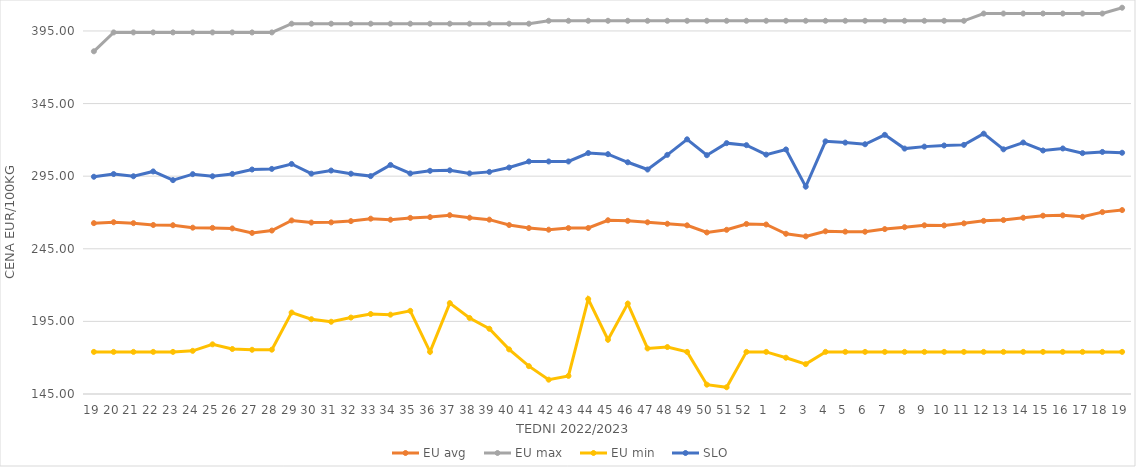
| Category | EU avg | EU max | EU min | SLO |
|---|---|---|---|---|
| 19.0 | 262.669 | 381 | 174 | 294.6 |
| 20.0 | 263.291 | 394 | 174 | 296.48 |
| 21.0 | 262.64 | 394 | 174 | 294.94 |
| 22.0 | 261.388 | 394 | 174 | 298.26 |
| 23.0 | 261.228 | 394 | 174 | 292.27 |
| 24.0 | 259.544 | 394 | 174.72 | 296.39 |
| 25.0 | 259.395 | 394 | 179.2 | 294.93 |
| 26.0 | 259.018 | 394 | 176 | 296.56 |
| 27.0 | 255.922 | 394 | 175.451 | 299.59 |
| 28.0 | 257.564 | 394 | 175.52 | 300.01 |
| 29.0 | 264.52 | 400 | 201.097 | 303.41 |
| 30.0 | 263.067 | 400 | 196.496 | 296.73 |
| 31.0 | 263.196 | 400 | 194.756 | 298.88 |
| 32.0 | 264.059 | 400 | 197.634 | 296.7 |
| 33.0 | 265.729 | 400 | 200.07 | 295.05 |
| 34.0 | 265.016 | 400 | 199.637 | 302.73 |
| 35.0 | 266.273 | 400 | 202.277 | 296.86 |
| 36.0 | 266.807 | 400 | 174 | 298.7 |
| 37.0 | 268.136 | 400 | 207.594 | 299.02 |
| 38.0 | 266.39 | 400 | 197.352 | 296.91 |
| 39.0 | 265.059 | 400 | 189.926 | 297.96 |
| 40.0 | 261.35 | 400 | 175.723 | 300.95 |
| 41.0 | 259.271 | 400 | 164.165 | 305.13 |
| 42.0 | 258.146 | 402 | 154.869 | 305.13 |
| 43.0 | 259.256 | 402 | 157.459 | 305.13 |
| 44.0 | 259.32 | 402 | 210.415 | 310.93 |
| 45.0 | 264.649 | 402 | 182.35 | 310.16 |
| 46.0 | 264.228 | 402 | 207.247 | 304.58 |
| 47.0 | 263.24 | 402 | 176.378 | 299.59 |
| 48.0 | 262.225 | 402 | 177.332 | 309.69 |
| 49.0 | 261.152 | 402 | 174 | 320.38 |
| 50.0 | 256.24 | 402 | 151.434 | 309.44 |
| 51.0 | 258.071 | 402 | 149.638 | 317.74 |
| 52.0 | 262.088 | 402 | 174 | 316.36 |
| 1.0 | 261.716 | 402 | 174 | 309.84 |
| 2.0 | 255.331 | 402 | 169.983 | 313.4 |
| 3.0 | 253.546 | 402 | 165.574 | 287.81 |
| 4.0 | 257.051 | 402 | 174 | 318.98 |
| 5.0 | 256.808 | 402 | 174 | 318.13 |
| 6.0 | 256.75 | 402 | 174 | 316.99 |
| 7.0 | 258.565 | 402 | 174 | 323.47 |
| 8.0 | 259.872 | 402 | 174 | 314 |
| 9.0 | 261.164 | 402 | 174 | 315.35 |
| 10.0 | 261.06 | 402 | 174 | 316.13 |
| 11.0 | 262.513 | 402 | 174 | 316.55 |
| 12.0 | 264.228 | 407 | 174 | 324.27 |
| 13.0 | 264.768 | 407 | 174 | 313.49 |
| 14.0 | 266.385 | 407 | 174 | 318.17 |
| 15.0 | 267.797 | 407 | 174 | 312.7 |
| 16.0 | 268.021 | 407 | 174 | 314.07 |
| 17.0 | 267.039 | 407 | 174 | 310.87 |
| 18.0 | 270.254 | 407 | 174 | 311.69 |
| 19.0 | 271.662 | 411 | 174 | 311.13 |